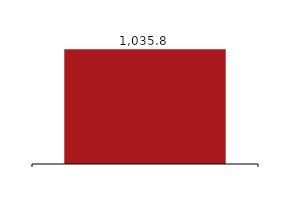
| Category | Total Assets |
|---|---|
|  | 1035822 |